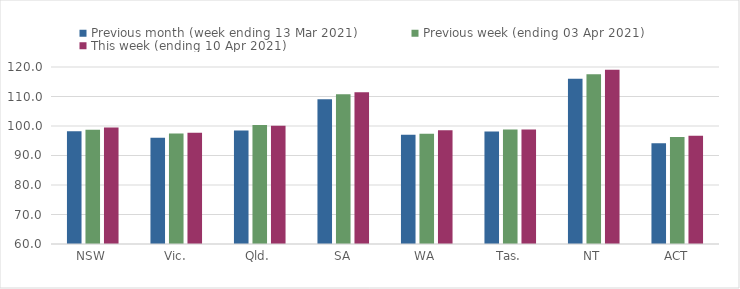
| Category | Previous month (week ending 13 Mar 2021) | Previous week (ending 03 Apr 2021) | This week (ending 10 Apr 2021) |
|---|---|---|---|
| NSW | 98.18 | 98.76 | 99.51 |
| Vic. | 96 | 97.5 | 97.67 |
| Qld. | 98.47 | 100.33 | 100.09 |
| SA | 109.09 | 110.79 | 111.43 |
| WA | 97.01 | 97.34 | 98.56 |
| Tas. | 98.11 | 98.81 | 98.81 |
| NT | 116.04 | 117.57 | 119.09 |
| ACT | 94.18 | 96.26 | 96.68 |